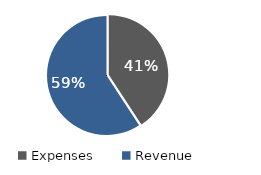
| Category | Series 0 |
|---|---|
| Expenses | 0.408 |
| Revenue | 0.592 |